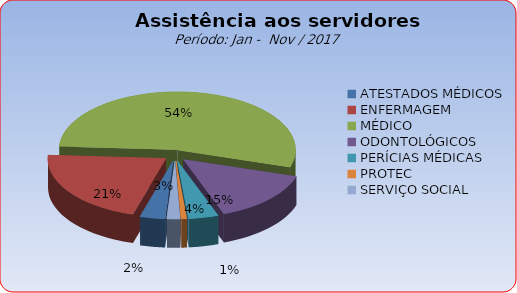
| Category | Series 0 |
|---|---|
| ATESTADOS MÉDICOS | 3.402 |
| ENFERMAGEM | 21.393 |
| MÉDICO | 53.876 |
| ODONTOLÓGICOS | 14.653 |
| PERÍCIAS MÉDICAS | 4.092 |
| PROTEC | 0.77 |
| SERVIÇO SOCIAL | 1.814 |